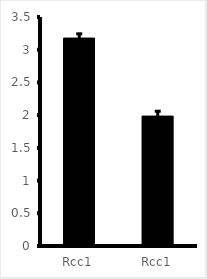
| Category | Series 0 |
|---|---|
| Rcc1 | 3.178 |
| Rcc1 | 1.986 |